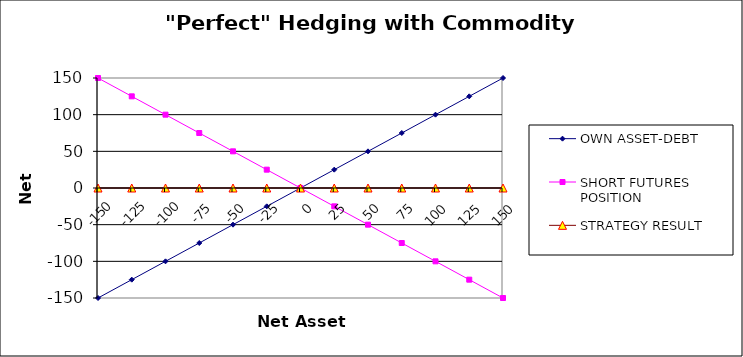
| Category | OWN ASSET-DEBT | SHORT FUTURES POSITION | STRATEGY RESULT |
|---|---|---|---|
| -150.0 | -150 | 150 | 0 |
| -125.0 | -125 | 125 | 0 |
| -100.0 | -100 | 100 | 0 |
| -75.0 | -75 | 75 | 0 |
| -50.0 | -50 | 50 | 0 |
| -25.0 | -25 | 25 | 0 |
| 0.0 | 0 | 0 | 0 |
| 25.0 | 25 | -25 | 0 |
| 50.0 | 50 | -50 | 0 |
| 75.0 | 75 | -75 | 0 |
| 100.0 | 100 | -100 | 0 |
| 125.0 | 125 | -125 | 0 |
| 150.0 | 150 | -150 | 0 |